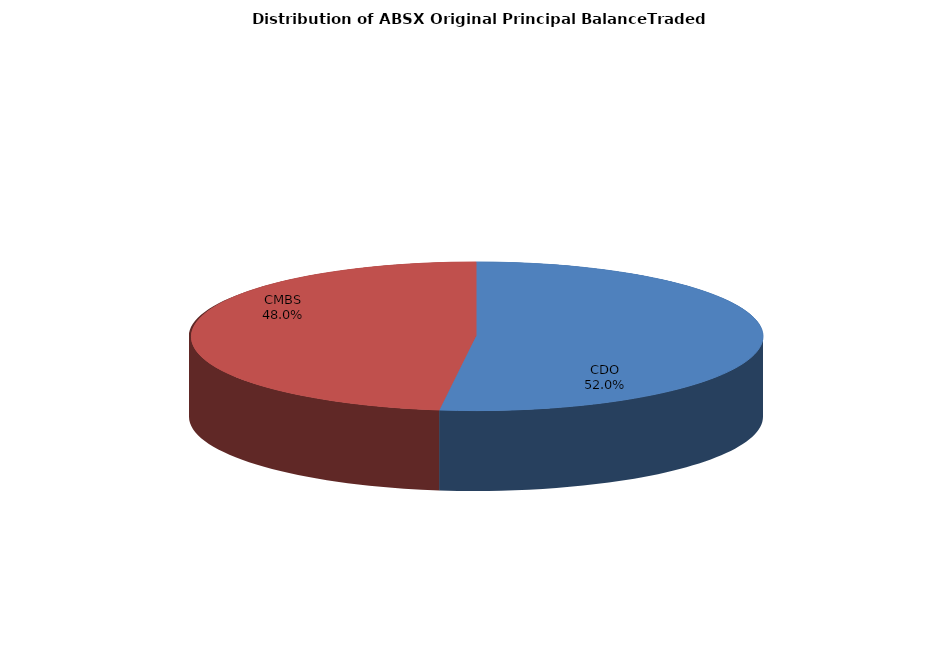
| Category | Series 0 |
|---|---|
| CDO | 1870068801.131 |
| CMBS | 1723997822.677 |